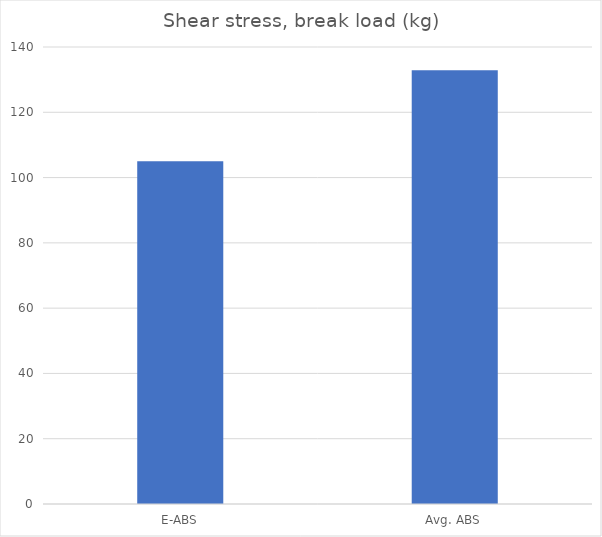
| Category | Break kg |
|---|---|
| E-ABS | 105 |
| Avg. ABS | 132.9 |